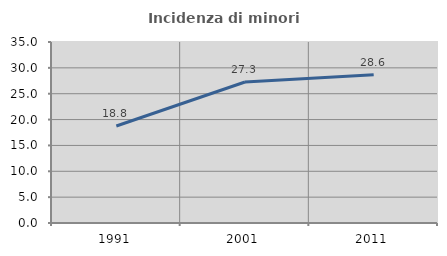
| Category | Incidenza di minori stranieri |
|---|---|
| 1991.0 | 18.75 |
| 2001.0 | 27.273 |
| 2011.0 | 28.646 |